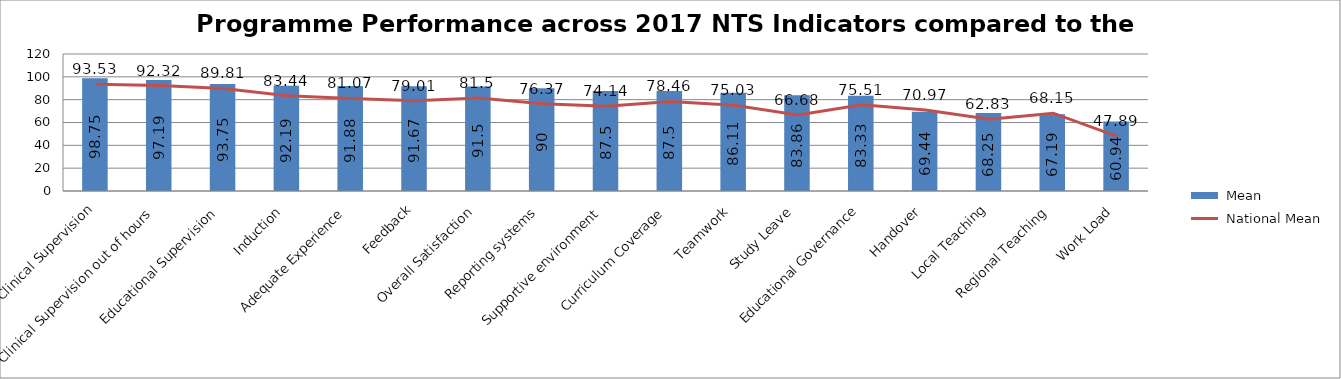
| Category |  Mean |
|---|---|
| Clinical Supervision | 98.75 |
| Clinical Supervision out of hours | 97.19 |
| Educational Supervision | 93.75 |
| Induction | 92.19 |
| Adequate Experience | 91.88 |
| Feedback | 91.67 |
| Overall Satisfaction | 91.5 |
| Reporting systems | 90 |
| Supportive environment | 87.5 |
| Curriculum Coverage | 87.5 |
| Teamwork | 86.11 |
| Study Leave | 83.86 |
| Educational Governance | 83.33 |
| Handover | 69.44 |
| Local Teaching | 68.25 |
| Regional Teaching | 67.19 |
| Work Load | 60.94 |